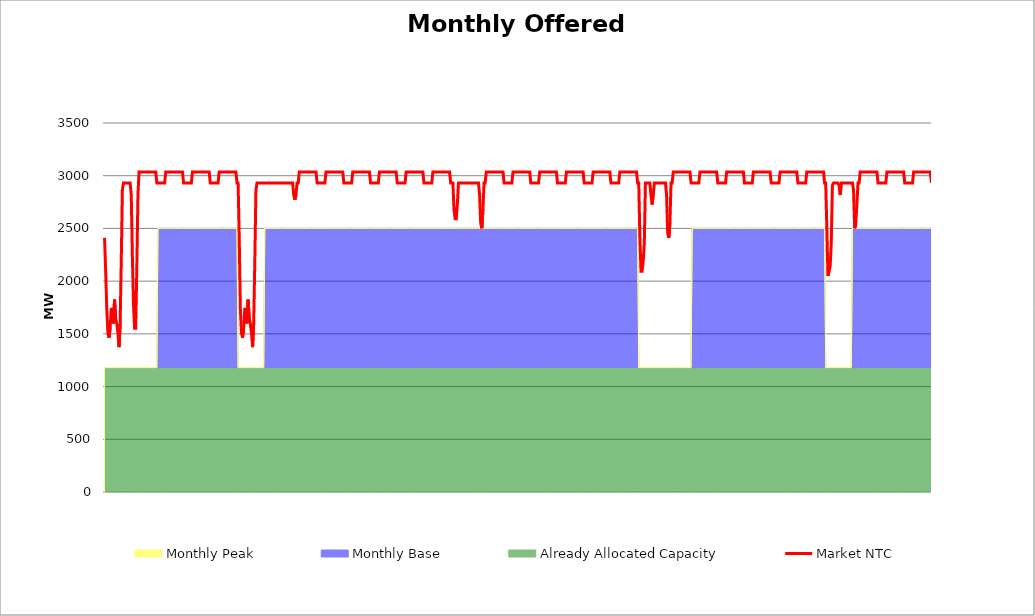
| Category | Market NTC |
|---|---|
| 0 | 2411 |
| 1 | 2095 |
| 2 | 1734 |
| 3 | 1509 |
| 4 | 1464 |
| 5 | 1554 |
| 6 | 1734 |
| 7 | 1734 |
| 8 | 1599 |
| 9 | 1825 |
| 10 | 1644 |
| 11 | 1599 |
| 12 | 1509 |
| 13 | 1374 |
| 14 | 1599 |
| 15 | 2185 |
| 16 | 2862 |
| 17 | 2932 |
| 18 | 2932 |
| 19 | 2932 |
| 20 | 2932 |
| 21 | 2932 |
| 22 | 2932 |
| 23 | 2932 |
| 24 | 2817 |
| 25 | 2231 |
| 26 | 1780 |
| 27 | 1554 |
| 28 | 1554 |
| 29 | 2140 |
| 30 | 2817 |
| 31 | 3036 |
| 32 | 3036 |
| 33 | 3036 |
| 34 | 3036 |
| 35 | 3036 |
| 36 | 3036 |
| 37 | 3036 |
| 38 | 3036 |
| 39 | 3036 |
| 40 | 3036 |
| 41 | 3036 |
| 42 | 3036 |
| 43 | 3036 |
| 44 | 3036 |
| 45 | 3036 |
| 46 | 3036 |
| 47 | 2932 |
| 48 | 2932 |
| 49 | 2932 |
| 50 | 2932 |
| 51 | 2932 |
| 52 | 2932 |
| 53 | 2932 |
| 54 | 2932 |
| 55 | 3036 |
| 56 | 3036 |
| 57 | 3036 |
| 58 | 3036 |
| 59 | 3036 |
| 60 | 3036 |
| 61 | 3036 |
| 62 | 3036 |
| 63 | 3036 |
| 64 | 3036 |
| 65 | 3036 |
| 66 | 3036 |
| 67 | 3036 |
| 68 | 3036 |
| 69 | 3036 |
| 70 | 3036 |
| 71 | 2932 |
| 72 | 2932 |
| 73 | 2932 |
| 74 | 2932 |
| 75 | 2932 |
| 76 | 2932 |
| 77 | 2932 |
| 78 | 2932 |
| 79 | 3036 |
| 80 | 3036 |
| 81 | 3036 |
| 82 | 3036 |
| 83 | 3036 |
| 84 | 3036 |
| 85 | 3036 |
| 86 | 3036 |
| 87 | 3036 |
| 88 | 3036 |
| 89 | 3036 |
| 90 | 3036 |
| 91 | 3036 |
| 92 | 3036 |
| 93 | 3036 |
| 94 | 3036 |
| 95 | 2932 |
| 96 | 2932 |
| 97 | 2932 |
| 98 | 2932 |
| 99 | 2932 |
| 100 | 2932 |
| 101 | 2932 |
| 102 | 2932 |
| 103 | 3036 |
| 104 | 3036 |
| 105 | 3036 |
| 106 | 3036 |
| 107 | 3036 |
| 108 | 3036 |
| 109 | 3036 |
| 110 | 3036 |
| 111 | 3036 |
| 112 | 3036 |
| 113 | 3036 |
| 114 | 3036 |
| 115 | 3036 |
| 116 | 3036 |
| 117 | 3036 |
| 118 | 3036 |
| 119 | 2932 |
| 120 | 2932 |
| 121 | 2420 |
| 122 | 1744 |
| 123 | 1509 |
| 124 | 1464 |
| 125 | 1554 |
| 126 | 1734 |
| 127 | 1734 |
| 128 | 1599 |
| 129 | 1825 |
| 130 | 1644 |
| 131 | 1599 |
| 132 | 1509 |
| 133 | 1374 |
| 134 | 1599 |
| 135 | 2185 |
| 136 | 2862 |
| 137 | 2932 |
| 138 | 2932 |
| 139 | 2932 |
| 140 | 2932 |
| 141 | 2932 |
| 142 | 2932 |
| 143 | 2932 |
| 144 | 2932 |
| 145 | 2932 |
| 146 | 2932 |
| 147 | 2932 |
| 148 | 2932 |
| 149 | 2932 |
| 150 | 2932 |
| 151 | 2932 |
| 152 | 2932 |
| 153 | 2932 |
| 154 | 2932 |
| 155 | 2932 |
| 156 | 2932 |
| 157 | 2932 |
| 158 | 2932 |
| 159 | 2932 |
| 160 | 2932 |
| 161 | 2932 |
| 162 | 2932 |
| 163 | 2932 |
| 164 | 2932 |
| 165 | 2932 |
| 166 | 2932 |
| 167 | 2932 |
| 168 | 2932 |
| 169 | 2932 |
| 170 | 2817 |
| 171 | 2772 |
| 172 | 2817 |
| 173 | 2932 |
| 174 | 2932 |
| 175 | 3036 |
| 176 | 3036 |
| 177 | 3036 |
| 178 | 3036 |
| 179 | 3036 |
| 180 | 3036 |
| 181 | 3036 |
| 182 | 3036 |
| 183 | 3036 |
| 184 | 3036 |
| 185 | 3036 |
| 186 | 3036 |
| 187 | 3036 |
| 188 | 3036 |
| 189 | 3036 |
| 190 | 3036 |
| 191 | 2932 |
| 192 | 2932 |
| 193 | 2932 |
| 194 | 2932 |
| 195 | 2932 |
| 196 | 2932 |
| 197 | 2932 |
| 198 | 2932 |
| 199 | 3036 |
| 200 | 3036 |
| 201 | 3036 |
| 202 | 3036 |
| 203 | 3036 |
| 204 | 3036 |
| 205 | 3036 |
| 206 | 3036 |
| 207 | 3036 |
| 208 | 3036 |
| 209 | 3036 |
| 210 | 3036 |
| 211 | 3036 |
| 212 | 3036 |
| 213 | 3036 |
| 214 | 3036 |
| 215 | 2932 |
| 216 | 2932 |
| 217 | 2932 |
| 218 | 2932 |
| 219 | 2932 |
| 220 | 2932 |
| 221 | 2932 |
| 222 | 2932 |
| 223 | 3036 |
| 224 | 3036 |
| 225 | 3036 |
| 226 | 3036 |
| 227 | 3036 |
| 228 | 3036 |
| 229 | 3036 |
| 230 | 3036 |
| 231 | 3036 |
| 232 | 3036 |
| 233 | 3036 |
| 234 | 3036 |
| 235 | 3036 |
| 236 | 3036 |
| 237 | 3036 |
| 238 | 3036 |
| 239 | 2932 |
| 240 | 2932 |
| 241 | 2932 |
| 242 | 2932 |
| 243 | 2932 |
| 244 | 2932 |
| 245 | 2932 |
| 246 | 2932 |
| 247 | 3036 |
| 248 | 3036 |
| 249 | 3036 |
| 250 | 3036 |
| 251 | 3036 |
| 252 | 3036 |
| 253 | 3036 |
| 254 | 3036 |
| 255 | 3036 |
| 256 | 3036 |
| 257 | 3036 |
| 258 | 3036 |
| 259 | 3036 |
| 260 | 3036 |
| 261 | 3036 |
| 262 | 3036 |
| 263 | 2932 |
| 264 | 2932 |
| 265 | 2932 |
| 266 | 2932 |
| 267 | 2932 |
| 268 | 2932 |
| 269 | 2932 |
| 270 | 2932 |
| 271 | 3036 |
| 272 | 3036 |
| 273 | 3036 |
| 274 | 3036 |
| 275 | 3036 |
| 276 | 3036 |
| 277 | 3036 |
| 278 | 3036 |
| 279 | 3036 |
| 280 | 3036 |
| 281 | 3036 |
| 282 | 3036 |
| 283 | 3036 |
| 284 | 3036 |
| 285 | 3036 |
| 286 | 3036 |
| 287 | 2932 |
| 288 | 2932 |
| 289 | 2932 |
| 290 | 2932 |
| 291 | 2932 |
| 292 | 2932 |
| 293 | 2932 |
| 294 | 2932 |
| 295 | 3036 |
| 296 | 3036 |
| 297 | 3036 |
| 298 | 3036 |
| 299 | 3036 |
| 300 | 3036 |
| 301 | 3036 |
| 302 | 3036 |
| 303 | 3036 |
| 304 | 3036 |
| 305 | 3036 |
| 306 | 3036 |
| 307 | 3036 |
| 308 | 3036 |
| 309 | 3036 |
| 310 | 3036 |
| 311 | 2932 |
| 312 | 2932 |
| 313 | 2932 |
| 314 | 2681 |
| 315 | 2591 |
| 316 | 2591 |
| 317 | 2727 |
| 318 | 2932 |
| 319 | 2932 |
| 320 | 2932 |
| 321 | 2932 |
| 322 | 2932 |
| 323 | 2932 |
| 324 | 2932 |
| 325 | 2932 |
| 326 | 2932 |
| 327 | 2932 |
| 328 | 2932 |
| 329 | 2932 |
| 330 | 2932 |
| 331 | 2932 |
| 332 | 2932 |
| 333 | 2932 |
| 334 | 2932 |
| 335 | 2932 |
| 336 | 2932 |
| 337 | 2817 |
| 338 | 2546 |
| 339 | 2501 |
| 340 | 2681 |
| 341 | 2932 |
| 342 | 2932 |
| 343 | 3036 |
| 344 | 3036 |
| 345 | 3036 |
| 346 | 3036 |
| 347 | 3036 |
| 348 | 3036 |
| 349 | 3036 |
| 350 | 3036 |
| 351 | 3036 |
| 352 | 3036 |
| 353 | 3036 |
| 354 | 3036 |
| 355 | 3036 |
| 356 | 3036 |
| 357 | 3036 |
| 358 | 3036 |
| 359 | 2932 |
| 360 | 2932 |
| 361 | 2932 |
| 362 | 2932 |
| 363 | 2932 |
| 364 | 2932 |
| 365 | 2932 |
| 366 | 2932 |
| 367 | 3036 |
| 368 | 3036 |
| 369 | 3036 |
| 370 | 3036 |
| 371 | 3036 |
| 372 | 3036 |
| 373 | 3036 |
| 374 | 3036 |
| 375 | 3036 |
| 376 | 3036 |
| 377 | 3036 |
| 378 | 3036 |
| 379 | 3036 |
| 380 | 3036 |
| 381 | 3036 |
| 382 | 3036 |
| 383 | 2932 |
| 384 | 2932 |
| 385 | 2932 |
| 386 | 2932 |
| 387 | 2932 |
| 388 | 2932 |
| 389 | 2932 |
| 390 | 2932 |
| 391 | 3036 |
| 392 | 3036 |
| 393 | 3036 |
| 394 | 3036 |
| 395 | 3036 |
| 396 | 3036 |
| 397 | 3036 |
| 398 | 3036 |
| 399 | 3036 |
| 400 | 3036 |
| 401 | 3036 |
| 402 | 3036 |
| 403 | 3036 |
| 404 | 3036 |
| 405 | 3036 |
| 406 | 3036 |
| 407 | 2932 |
| 408 | 2932 |
| 409 | 2932 |
| 410 | 2932 |
| 411 | 2932 |
| 412 | 2932 |
| 413 | 2932 |
| 414 | 2932 |
| 415 | 3036 |
| 416 | 3036 |
| 417 | 3036 |
| 418 | 3036 |
| 419 | 3036 |
| 420 | 3036 |
| 421 | 3036 |
| 422 | 3036 |
| 423 | 3036 |
| 424 | 3036 |
| 425 | 3036 |
| 426 | 3036 |
| 427 | 3036 |
| 428 | 3036 |
| 429 | 3036 |
| 430 | 3036 |
| 431 | 2932 |
| 432 | 2932 |
| 433 | 2932 |
| 434 | 2932 |
| 435 | 2932 |
| 436 | 2932 |
| 437 | 2932 |
| 438 | 2932 |
| 439 | 3036 |
| 440 | 3036 |
| 441 | 3036 |
| 442 | 3036 |
| 443 | 3036 |
| 444 | 3036 |
| 445 | 3036 |
| 446 | 3036 |
| 447 | 3036 |
| 448 | 3036 |
| 449 | 3036 |
| 450 | 3036 |
| 451 | 3036 |
| 452 | 3036 |
| 453 | 3036 |
| 454 | 3036 |
| 455 | 2932 |
| 456 | 2932 |
| 457 | 2932 |
| 458 | 2932 |
| 459 | 2932 |
| 460 | 2932 |
| 461 | 2932 |
| 462 | 2932 |
| 463 | 3036 |
| 464 | 3036 |
| 465 | 3036 |
| 466 | 3036 |
| 467 | 3036 |
| 468 | 3036 |
| 469 | 3036 |
| 470 | 3036 |
| 471 | 3036 |
| 472 | 3036 |
| 473 | 3036 |
| 474 | 3036 |
| 475 | 3036 |
| 476 | 3036 |
| 477 | 3036 |
| 478 | 3036 |
| 479 | 2932 |
| 480 | 2932 |
| 481 | 2420 |
| 482 | 2095 |
| 483 | 2095 |
| 484 | 2185 |
| 485 | 2366 |
| 486 | 2932 |
| 487 | 2932 |
| 488 | 2932 |
| 489 | 2932 |
| 490 | 2932 |
| 491 | 2817 |
| 492 | 2727 |
| 493 | 2817 |
| 494 | 2932 |
| 495 | 2932 |
| 496 | 2932 |
| 497 | 2932 |
| 498 | 2932 |
| 499 | 2932 |
| 500 | 2932 |
| 501 | 2932 |
| 502 | 2932 |
| 503 | 2932 |
| 504 | 2932 |
| 505 | 2817 |
| 506 | 2456 |
| 507 | 2411 |
| 508 | 2546 |
| 509 | 2932 |
| 510 | 2932 |
| 511 | 3036 |
| 512 | 3036 |
| 513 | 3036 |
| 514 | 3036 |
| 515 | 3036 |
| 516 | 3036 |
| 517 | 3036 |
| 518 | 3036 |
| 519 | 3036 |
| 520 | 3036 |
| 521 | 3036 |
| 522 | 3036 |
| 523 | 3036 |
| 524 | 3036 |
| 525 | 3036 |
| 526 | 3036 |
| 527 | 2932 |
| 528 | 2932 |
| 529 | 2932 |
| 530 | 2932 |
| 531 | 2932 |
| 532 | 2932 |
| 533 | 2932 |
| 534 | 2932 |
| 535 | 3036 |
| 536 | 3036 |
| 537 | 3036 |
| 538 | 3036 |
| 539 | 3036 |
| 540 | 3036 |
| 541 | 3036 |
| 542 | 3036 |
| 543 | 3036 |
| 544 | 3036 |
| 545 | 3036 |
| 546 | 3036 |
| 547 | 3036 |
| 548 | 3036 |
| 549 | 3036 |
| 550 | 3036 |
| 551 | 2932 |
| 552 | 2932 |
| 553 | 2932 |
| 554 | 2932 |
| 555 | 2932 |
| 556 | 2932 |
| 557 | 2932 |
| 558 | 2932 |
| 559 | 3036 |
| 560 | 3036 |
| 561 | 3036 |
| 562 | 3036 |
| 563 | 3036 |
| 564 | 3036 |
| 565 | 3036 |
| 566 | 3036 |
| 567 | 3036 |
| 568 | 3036 |
| 569 | 3036 |
| 570 | 3036 |
| 571 | 3036 |
| 572 | 3036 |
| 573 | 3036 |
| 574 | 3036 |
| 575 | 2932 |
| 576 | 2932 |
| 577 | 2932 |
| 578 | 2932 |
| 579 | 2932 |
| 580 | 2932 |
| 581 | 2932 |
| 582 | 2932 |
| 583 | 3036 |
| 584 | 3036 |
| 585 | 3036 |
| 586 | 3036 |
| 587 | 3036 |
| 588 | 3036 |
| 589 | 3036 |
| 590 | 3036 |
| 591 | 3036 |
| 592 | 3036 |
| 593 | 3036 |
| 594 | 3036 |
| 595 | 3036 |
| 596 | 3036 |
| 597 | 3036 |
| 598 | 3036 |
| 599 | 2932 |
| 600 | 2932 |
| 601 | 2932 |
| 602 | 2932 |
| 603 | 2932 |
| 604 | 2932 |
| 605 | 2932 |
| 606 | 2932 |
| 607 | 3036 |
| 608 | 3036 |
| 609 | 3036 |
| 610 | 3036 |
| 611 | 3036 |
| 612 | 3036 |
| 613 | 3036 |
| 614 | 3036 |
| 615 | 3036 |
| 616 | 3036 |
| 617 | 3036 |
| 618 | 3036 |
| 619 | 3036 |
| 620 | 3036 |
| 621 | 3036 |
| 622 | 3036 |
| 623 | 2932 |
| 624 | 2932 |
| 625 | 2932 |
| 626 | 2932 |
| 627 | 2932 |
| 628 | 2932 |
| 629 | 2932 |
| 630 | 2932 |
| 631 | 3036 |
| 632 | 3036 |
| 633 | 3036 |
| 634 | 3036 |
| 635 | 3036 |
| 636 | 3036 |
| 637 | 3036 |
| 638 | 3036 |
| 639 | 3036 |
| 640 | 3036 |
| 641 | 3036 |
| 642 | 3036 |
| 643 | 3036 |
| 644 | 3036 |
| 645 | 3036 |
| 646 | 3036 |
| 647 | 2932 |
| 648 | 2932 |
| 649 | 2501 |
| 650 | 2050 |
| 651 | 2095 |
| 652 | 2140 |
| 653 | 2366 |
| 654 | 2907 |
| 655 | 2932 |
| 656 | 2932 |
| 657 | 2932 |
| 658 | 2932 |
| 659 | 2932 |
| 660 | 2907 |
| 661 | 2817 |
| 662 | 2932 |
| 663 | 2932 |
| 664 | 2932 |
| 665 | 2932 |
| 666 | 2932 |
| 667 | 2932 |
| 668 | 2932 |
| 669 | 2932 |
| 670 | 2932 |
| 671 | 2932 |
| 672 | 2932 |
| 673 | 2862 |
| 674 | 2501 |
| 675 | 2546 |
| 676 | 2727 |
| 677 | 2932 |
| 678 | 2932 |
| 679 | 3036 |
| 680 | 3036 |
| 681 | 3036 |
| 682 | 3036 |
| 683 | 3036 |
| 684 | 3036 |
| 685 | 3036 |
| 686 | 3036 |
| 687 | 3036 |
| 688 | 3036 |
| 689 | 3036 |
| 690 | 3036 |
| 691 | 3036 |
| 692 | 3036 |
| 693 | 3036 |
| 694 | 3036 |
| 695 | 2932 |
| 696 | 2932 |
| 697 | 2932 |
| 698 | 2932 |
| 699 | 2932 |
| 700 | 2932 |
| 701 | 2932 |
| 702 | 2932 |
| 703 | 3036 |
| 704 | 3036 |
| 705 | 3036 |
| 706 | 3036 |
| 707 | 3036 |
| 708 | 3036 |
| 709 | 3036 |
| 710 | 3036 |
| 711 | 3036 |
| 712 | 3036 |
| 713 | 3036 |
| 714 | 3036 |
| 715 | 3036 |
| 716 | 3036 |
| 717 | 3036 |
| 718 | 3036 |
| 719 | 2932 |
| 720 | 2932 |
| 721 | 2932 |
| 722 | 2932 |
| 723 | 2932 |
| 724 | 2932 |
| 725 | 2932 |
| 726 | 2932 |
| 727 | 3036 |
| 728 | 3036 |
| 729 | 3036 |
| 730 | 3036 |
| 731 | 3036 |
| 732 | 3036 |
| 733 | 3036 |
| 734 | 3036 |
| 735 | 3036 |
| 736 | 3036 |
| 737 | 3036 |
| 738 | 3036 |
| 739 | 3036 |
| 740 | 3036 |
| 741 | 3036 |
| 742 | 3036 |
| 743 | 2932 |